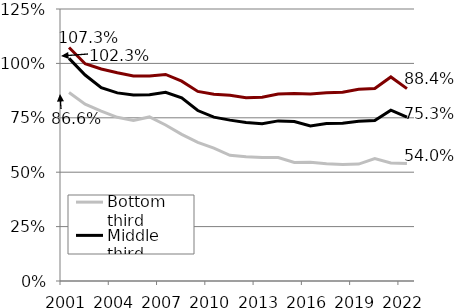
| Category | Bottom third | Middle third | Top third |
|---|---|---|---|
| 2001.0 | 0.866 | 1.023 | 1.073 |
| 2002.0 | 0.812 | 0.947 | 0.998 |
| 2003.0 | 0.781 | 0.888 | 0.974 |
| 2004.0 | 0.752 | 0.864 | 0.957 |
| 2005.0 | 0.738 | 0.855 | 0.942 |
| 2006.0 | 0.754 | 0.856 | 0.942 |
| 2007.0 | 0.717 | 0.867 | 0.949 |
| 2008.0 | 0.674 | 0.841 | 0.918 |
| 2009.0 | 0.637 | 0.783 | 0.871 |
| 2010.0 | 0.61 | 0.753 | 0.859 |
| 2011.0 | 0.578 | 0.739 | 0.853 |
| 2012.0 | 0.571 | 0.728 | 0.842 |
| 2013.0 | 0.567 | 0.723 | 0.845 |
| 2014.0 | 0.567 | 0.736 | 0.859 |
| 2015.0 | 0.545 | 0.733 | 0.862 |
| 2016.0 | 0.546 | 0.712 | 0.859 |
| 2017.0 | 0.539 | 0.724 | 0.865 |
| 2018.0 | 0.536 | 0.725 | 0.868 |
| 2019.0 | 0.537 | 0.734 | 0.881 |
| 2020.0 | 0.562 | 0.737 | 0.884 |
| 2021.0 | 0.543 | 0.785 | 0.938 |
| 2022.0 | 0.54 | 0.753 | 0.884 |